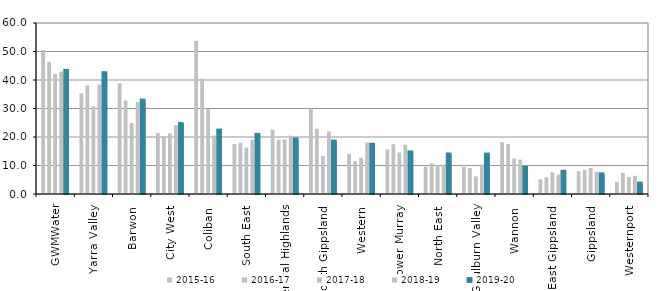
| Category | 2015-16 | 2016-17 | 2017-18 | 2018-19 | 2019-20 |
|---|---|---|---|---|---|
| GWMWater | 50.492 | 46.335 | 42.105 | 42.984 | 43.191 |
| Yarra Valley  | 35.318 | 38.09 | 30.722 | 38.4 | 42.392 |
| Barwon  | 38.845 | 32.777 | 24.934 | 32.292 | 32.773 |
| City West  | 21.372 | 20.33 | 21.299 | 24.16 | 24.534 |
| Coliban  | 53.734 | 40.454 | 29.758 | 20.528 | 22.255 |
| South East  | 17.579 | 17.955 | 16.248 | 18.99 | 20.743 |
| Central Highlands  | 22.613 | 19.051 | 19.134 | 20.469 | 19.147 |
| South Gippsland  | 29.916 | 22.917 | 13.4 | 21.937 | 18.395 |
| Western  | 14.081 | 11.522 | 12.737 | 18.071 | 17.286 |
| Lower Murray  | 15.627 | 17.465 | 14.552 | 17.325 | 14.565 |
| North East  | 9.592 | 10.714 | 10.253 | 10.294 | 13.854 |
| Goulburn Valley  | 9.52 | 9.126 | 6.197 | 10.347 | 13.822 |
| Wannon  | 18.174 | 17.617 | 12.434 | 12.065 | 9.154 |
| East Gippsland  | 5.21 | 5.883 | 7.638 | 6.892 | 7.787 |
| Gippsland  | 7.985 | 8.401 | 9.138 | 7.775 | 6.889 |
| Westernport  | 4.198 | 7.439 | 5.973 | 6.383 | 3.629 |